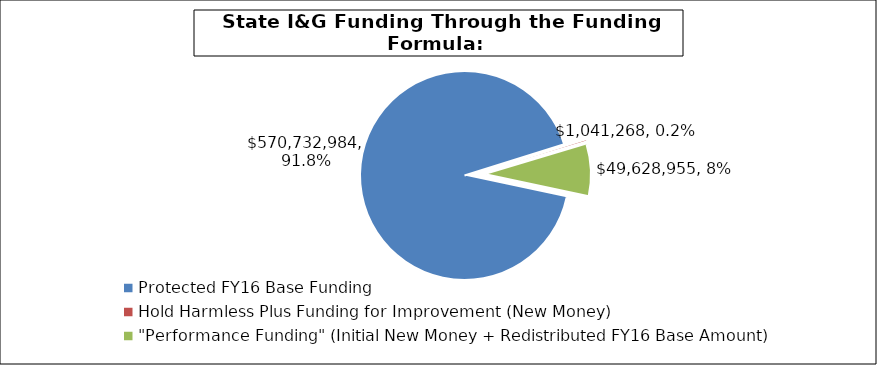
| Category | Series 0 |
|---|---|
| Protected FY16 Base Funding | 570732983.933 |
| Hold Harmless Plus Funding for Improvement (New Money) | 1041267.944 |
| "Performance Funding" (Initial New Money + Redistributed FY16 Base Amount) | 49628955.125 |